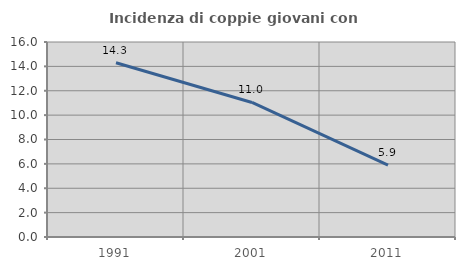
| Category | Incidenza di coppie giovani con figli |
|---|---|
| 1991.0 | 14.303 |
| 2001.0 | 11.039 |
| 2011.0 | 5.906 |